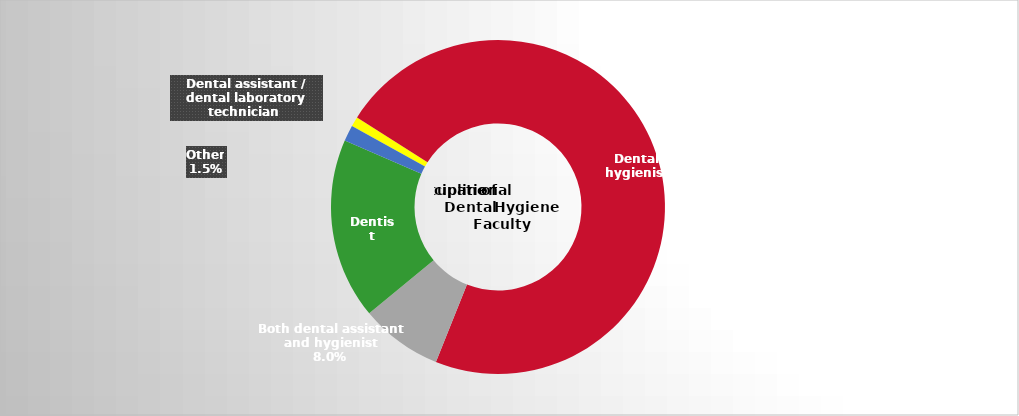
| Category | Series 2 |
|---|---|
| Dental assistant / dental laboratory technician  | 0.01 |
| Dental hygienist | 0.721 |
| Both dental assistant and hygienist | 0.08 |
| Dentist | 0.175 |
| Other | 0.015 |